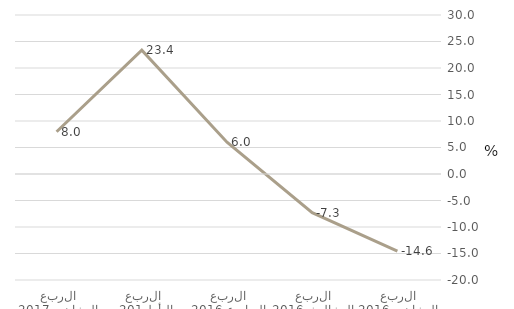
| Category | قطاع المشروعات غير المالية |
|---|---|
| الربع الثاني 2016 | -14.559 |
| الربع الثالث 2016 | -7.302 |
| الربع الرابع 2016 | 5.992 |
| الربع الأول 2017 | 23.358 |
| الربع الثاني 2017 | 7.979 |